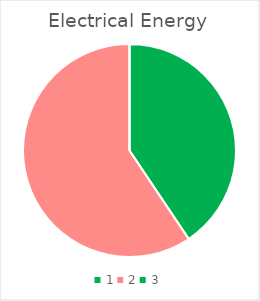
| Category | Series 0 |
|---|---|
| 0 | 1.535 |
| 1 | 2.245 |
| 2 | 0 |